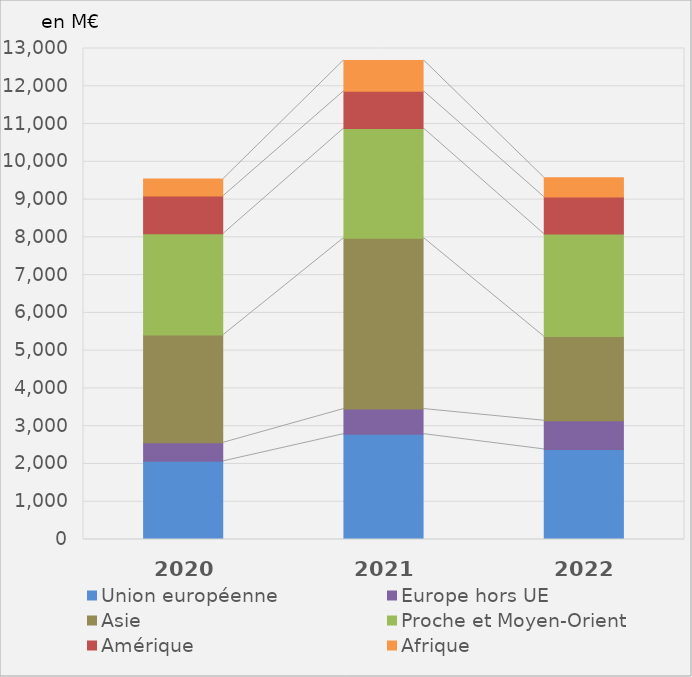
| Category | Union européenne | Europe hors UE | Asie | Proche et Moyen-Orient | Amérique | Afrique |
|---|---|---|---|---|---|---|
| 2020.0 | 2070.6 | 491.3 | 2852.5 | 2682.3 | 997.6 | 453.8 |
| 2021.0 | 2789.5 | 664.4 | 4524.5 | 2900.6 | 986 | 818.4 |
| 2022.0 | 2385.6 | 758.7 | 2227.6 | 2714.2 | 979.7 | 515.3 |